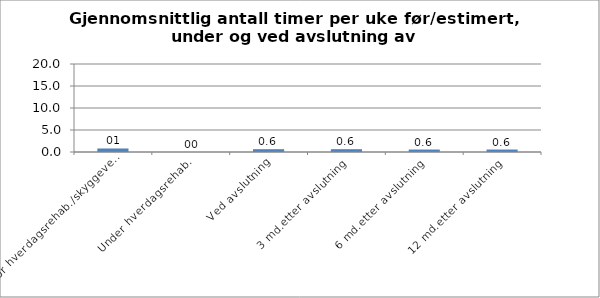
| Category | Timer per uke |
|---|---|
| Før hverdagsrehab./skyggevedtak | 0.8 |
| Under hverdagsrehab. | 0 |
| Ved avslutning | 0.64 |
| 3 md.etter avslutning | 0.64 |
| 6 md.etter avslutning | 0.56 |
| 12 md.etter avslutning | 0.56 |